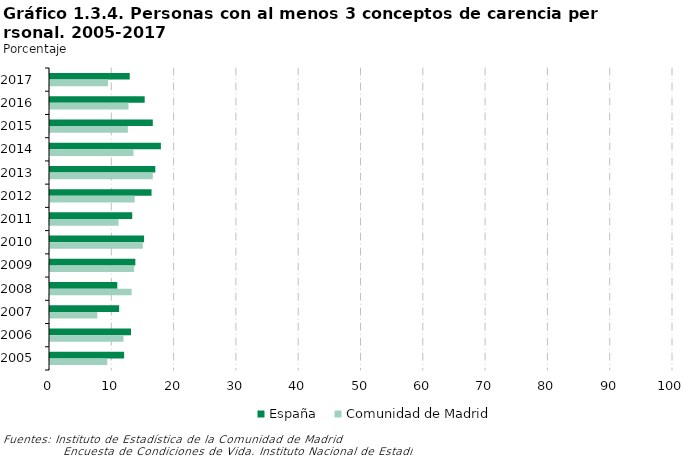
| Category | España | Comunidad de Madrid |
|---|---|---|
| 2017 | 12.8 | 9.3 |
| 2016 | 15.2 | 12.6 |
| 2015 | 16.5 | 12.5 |
| 2014 | 17.8 | 13.4 |
| 2013 | 16.9 | 16.5 |
| 2012 | 16.3 | 13.6 |
| 2011 | 13.2 | 11 |
| 2010 | 15.1 | 14.9 |
| 2009 | 13.7 | 13.5 |
| 2008 | 10.8 | 13.1 |
| 2007 | 11.1 | 7.6 |
| 2006 | 13 | 11.8 |
| 2005 | 11.9 | 9.2 |